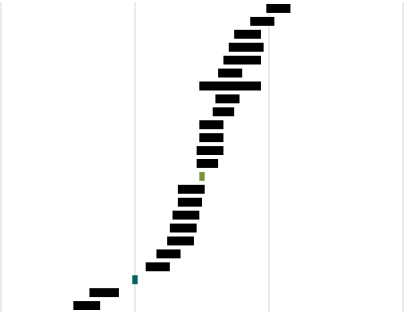
| Category | Series 0 | Series 1 | Series 2 | Series 3 | Series 4 | Series 5 |
|---|---|---|---|---|---|---|
| Finlande | 444 | 70 | 35 | 9 | 0 | 0 |
| Pologne | 427 | 77 | 39 | 9 | 0 | 0 |
| Slovénie | 420 | 79 | 38 | 10 | 0 | 0 |
| Hongrie | 393 | 100 | 42 | 13 | 0 | 0 |
| Suède | 410 | 86 | 37 | 14 | 0 | 0 |
| Angleterre | 417 | 73 | 41 | 9 | 0 | 0 |
| Bulgarie | 352 | 131 | 41 | 23 | 0 | 0 |
| République tchèque | 414 | 76 | 40 | 9 | 0 | 0 |
| Croatie | 426 | 68 | 35 | 8 | 0 | 0 |
| Irlande | 405 | 81 | 38 | 9 | 0 | 0 |
| Allemagne | 409 | 74 | 41 | 9 | 0 | 0 |
| Lituanie | 406 | 77 | 40 | 10 | 0 | 0 |
| Danemark | 406 | 77 | 40 | 8 | 0 | 0 |
| Moyenne européenne | 524 | 0 | 0 | 2 | 0 | 0 |
| Slovaquie | 362 | 111 | 43 | 10 | 0 | 0 |
| Irlande du Nord | 397 | 80 | 39 | 9 | 0 | 0 |
| Espagne | 399 | 75 | 40 | 10 | 0 | 0 |
| Pays-Bas | 414 | 64 | 35 | 10 | 0 | 0 |
| Italie | 399 | 76 | 37 | 10 | 0 | 0 |
| Belgique (Fl.) | 406 | 66 | 36 | 9 | 0 | 0 |
| Portugal | 407 | 62 | 35 | 9 | 0 | 0 |
| Point Central TIMSS | 499 | 0 | 0 | 2 | 0 | 0 |
| France | 363 | 77 | 43 | 11 | 0 | 0 |
| Chypre | 349 | 84 | 44 | 10 | 0 | 0 |